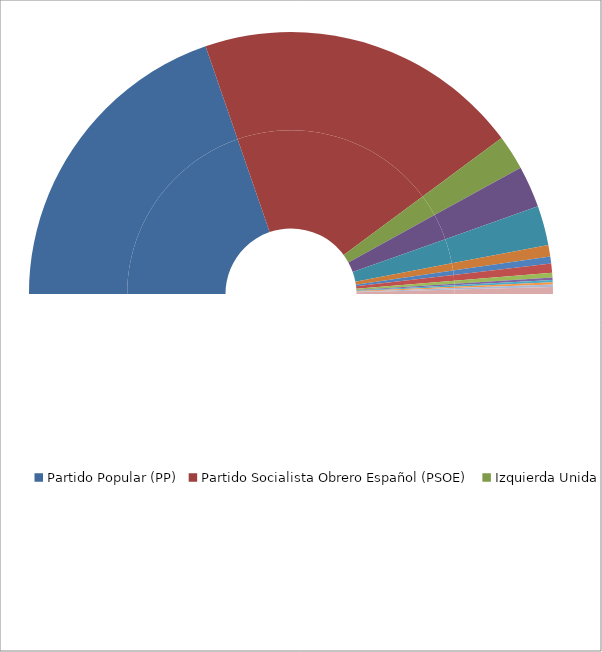
| Category | Series 0 | Series 1 |
|---|---|---|
| Partido Popular (PP) | 138 | 39.429 |
| Partido Socialista Obrero Español (PSOE) | 141 | 40.286 |
| Izquierda Unida (IU) | 15 | 4.286 |
| Partit dels Socialistes de Catalunya (PSC-PSOE) | 18 | 5.143 |
| Convergencia i Unió (CIU) | 17 | 4.857 |
| Eusko Alderdi Jetzalea - Partido Nacionalista Vasco (EAJ-PNV) | 5 | 1.429 |
| Iniciativa per Catalunya (IC) | 3 | 0.857 |
| Coalición Canaria (CC) | 4 | 1.143 |
| Herri Batasuna (HB) | 2 | 0.571 |
| Esquerra Republicana de Catalunya (ERC) | 1 | 0.286 |
| Partido Aragonés Regionalista (PAR) | 1 | 0.286 |
| Coalición Eusko Alkartasuna - Euskal Ezkerra (EA-EUE) | 1 | 0.286 |
| Unió Valenciana (UV) | 1 | 0.286 |
| Unión del Pueblo Navarro - Partido Popular (UPN-PP) | 3 | 0.857 |